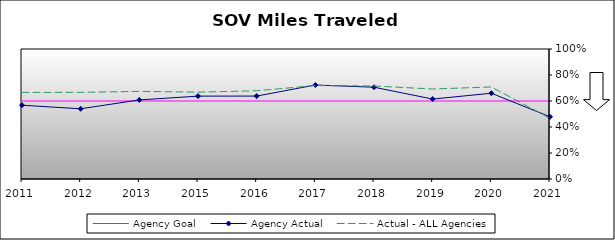
| Category | Agency Goal | Agency Actual | Actual - ALL Agencies |
|---|---|---|---|
| 2011.0 | 0.6 | 0.568 | 0.666 |
| 2012.0 | 0.6 | 0.54 | 0.666 |
| 2013.0 | 0.6 | 0.608 | 0.674 |
| 2015.0 | 0.6 | 0.637 | 0.668 |
| 2016.0 | 0.6 | 0.638 | 0.679 |
| 2017.0 | 0.6 | 0.723 | 0.719 |
| 2018.0 | 0.6 | 0.706 | 0.715 |
| 2019.0 | 0.6 | 0.615 | 0.692 |
| 2020.0 | 0.6 | 0.66 | 0.708 |
| 2021.0 | 0.6 | 0.478 | 0.467 |